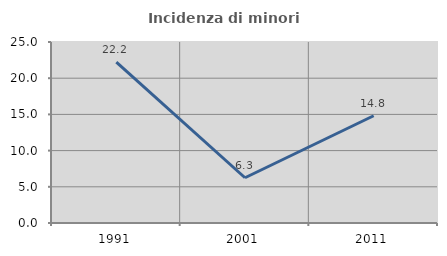
| Category | Incidenza di minori stranieri |
|---|---|
| 1991.0 | 22.222 |
| 2001.0 | 6.25 |
| 2011.0 | 14.815 |